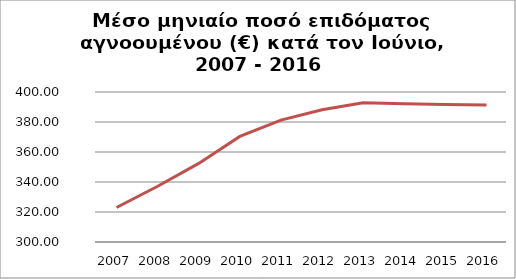
| Category | Series 1 |
|---|---|
| 2007.0 | 322.993 |
| 2008.0 | 337.19 |
| 2009.0 | 352.397 |
| 2010.0 | 370.359 |
| 2011.0 | 381.273 |
| 2012.0 | 388.193 |
| 2013.0 | 392.864 |
| 2014.0 | 392.227 |
| 2015.0 | 391.668 |
| 2016.0 | 391.32 |